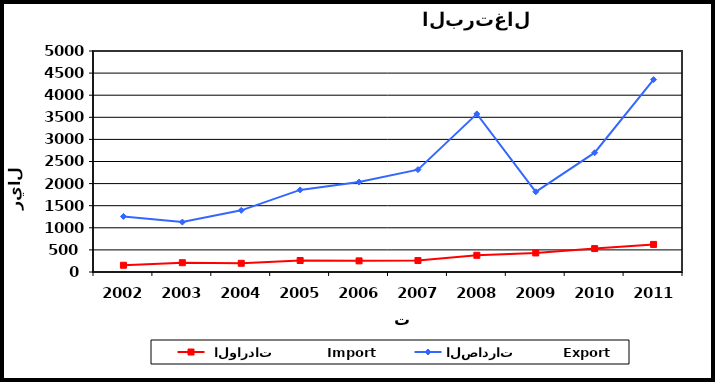
| Category |  الواردات           Import | الصادرات          Export |
|---|---|---|
| 2002.0 | 153 | 1257 |
| 2003.0 | 210 | 1129 |
| 2004.0 | 197 | 1395 |
| 2005.0 | 260 | 1857 |
| 2006.0 | 252 | 2035 |
| 2007.0 | 259 | 2316 |
| 2008.0 | 378 | 3577 |
| 2009.0 | 431 | 1814 |
| 2010.0 | 530 | 2699 |
| 2011.0 | 624 | 4353 |